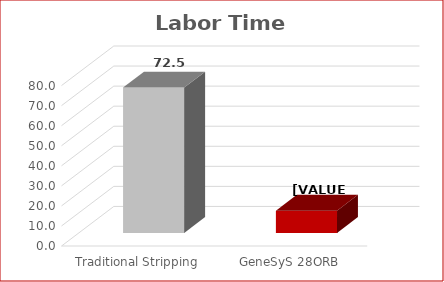
| Category | Labor Time (hr) |
|---|---|
| Traditional Stripping | 72.525 |
| GeneSyS 28ORB | 11.111 |